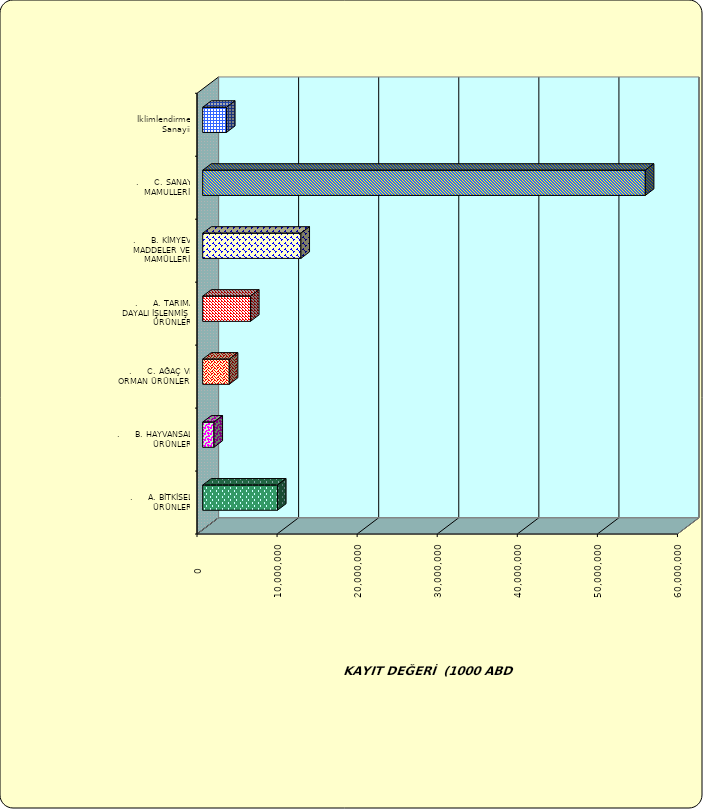
| Category | Series 0 |
|---|---|
| .     A. BİTKİSEL ÜRÜNLER | 9335671.366 |
| .     B. HAYVANSAL ÜRÜNLER | 1405302.49 |
| .     C. AĞAÇ VE ORMAN ÜRÜNLERİ | 3317717.942 |
| .     A. TARIMA DAYALI İŞLENMİŞ ÜRÜNLER | 5967576.699 |
| .     B. KİMYEVİ MADDELER VE MAMÜLLERİ | 12266170.422 |
| .     C. SANAYİ MAMULLERİ | 55272237.755 |
|  İklimlendirme Sanayii | 2968188.757 |